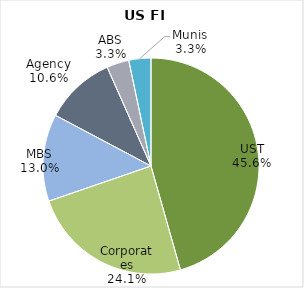
| Category | Fixed Income Issuance Breakout |
|---|---|
| UST | 0.456 |
| Corporates | 0.241 |
| MBS | 0.13 |
| Agency | 0.106 |
| ABS | 0.033 |
| Munis | 0.033 |